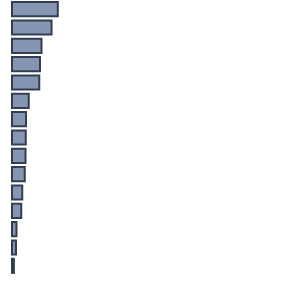
| Category | Series 0 |
|---|---|
| 0 | 16.9 |
| 1 | 14.6 |
| 2 | 10.9 |
| 3 | 10.3 |
| 4 | 10.1 |
| 5 | 6.2 |
| 6 | 5.2 |
| 7 | 5.1 |
| 8 | 5 |
| 9 | 4.7 |
| 10 | 3.8 |
| 11 | 3.4 |
| 12 | 1.7 |
| 13 | 1.5 |
| 14 | 0.7 |